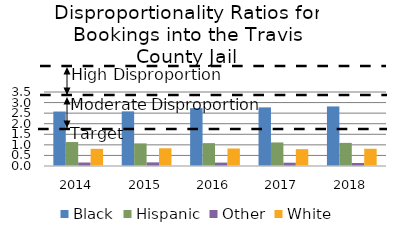
| Category | Black | Hispanic | Other | White |
|---|---|---|---|---|
| 2014.0 | 2.576 | 1.134 | 0.165 | 0.812 |
| 2015.0 | 2.583 | 1.069 | 0.172 | 0.839 |
| 2016.0 | 2.737 | 1.082 | 0.161 | 0.827 |
| 2017.0 | 2.773 | 1.114 | 0.156 | 0.798 |
| 2018.0 | 2.817 | 1.093 | 0.142 | 0.816 |